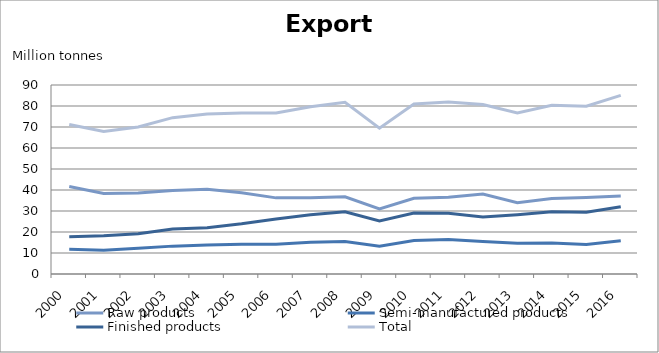
| Category | Raw products | Semi-manufactured products | Finished products | Total |
|---|---|---|---|---|
| 2000.0 | 41.688 | 11.758 | 17.752 | 71.198 |
| 2001.0 | 38.371 | 11.277 | 18.182 | 67.83 |
| 2002.0 | 38.577 | 12.277 | 19.143 | 69.998 |
| 2003.0 | 39.734 | 13.273 | 21.444 | 74.451 |
| 2004.0 | 40.405 | 13.753 | 22.066 | 76.225 |
| 2005.0 | 38.684 | 14.132 | 23.906 | 76.722 |
| 2006.0 | 36.256 | 14.162 | 26.212 | 76.629 |
| 2007.0 | 36.27 | 15.078 | 28.265 | 79.613 |
| 2008.0 | 36.749 | 15.423 | 29.631 | 81.803 |
| 2009.0 | 30.949 | 13.254 | 25.211 | 69.414 |
| 2010.0 | 36.017 | 15.931 | 29.011 | 80.96 |
| 2011.0 | 36.516 | 16.464 | 28.968 | 81.948 |
| 2012.0 | 38.104 | 15.532 | 27.102 | 80.737 |
| 2013.0 | 33.918 | 14.615 | 28.185 | 76.719 |
| 2014.0 | 35.964 | 14.786 | 29.615 | 80.364 |
| 2015.0 | 36.447 | 14.052 | 29.373 | 79.871 |
| 2016.0 | 37.172 | 15.832 | 32.07 | 85.074 |